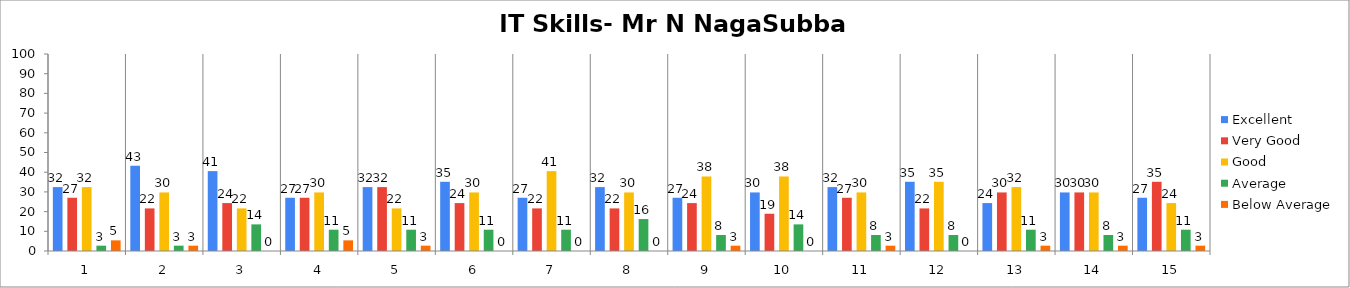
| Category | Excellent | Very Good | Good | Average | Below Average |
|---|---|---|---|---|---|
| 0 | 32.432 | 27.027 | 32.432 | 2.703 | 5.405 |
| 1 | 43.243 | 21.622 | 29.73 | 2.703 | 2.703 |
| 2 | 40.541 | 24.324 | 21.622 | 13.514 | 0 |
| 3 | 27.027 | 27.027 | 29.73 | 10.811 | 5.405 |
| 4 | 32.432 | 32.432 | 21.622 | 10.811 | 2.703 |
| 5 | 35.135 | 24.324 | 29.73 | 10.811 | 0 |
| 6 | 27.027 | 21.622 | 40.541 | 10.811 | 0 |
| 7 | 32.432 | 21.622 | 29.73 | 16.216 | 0 |
| 8 | 27.027 | 24.324 | 37.838 | 8.108 | 2.703 |
| 9 | 29.73 | 18.919 | 37.838 | 13.514 | 0 |
| 10 | 32.432 | 27.027 | 29.73 | 8.108 | 2.703 |
| 11 | 35.135 | 21.622 | 35.135 | 8.108 | 0 |
| 12 | 24.324 | 29.73 | 32.432 | 10.811 | 2.703 |
| 13 | 29.73 | 29.73 | 29.73 | 8.108 | 2.703 |
| 14 | 27.027 | 35.135 | 24.324 | 10.811 | 2.703 |